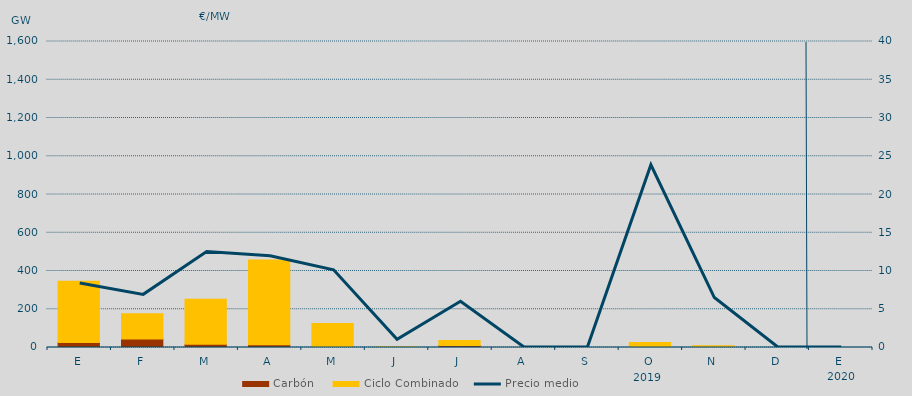
| Category | Carbón | Ciclo Combinado |
|---|---|---|
| E | 26403.5 | 320317.9 |
| F | 44880.1 | 131505 |
| M | 17298.8 | 234585 |
| A | 14816 | 442359.9 |
| M | 5017.5 | 120808.3 |
| J | 0 | 4200 |
| J | 10582.1 | 26246.2 |
| A | 0 | 0 |
| S | 0 | 0 |
| O | 0 | 25712.6 |
| N | 0 | 8552.1 |
| D | 0 | 0 |
| E | 0 | 0 |